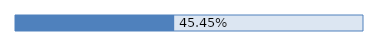
| Category | Series 0 |
|---|---|
| 0 | 0.455 |